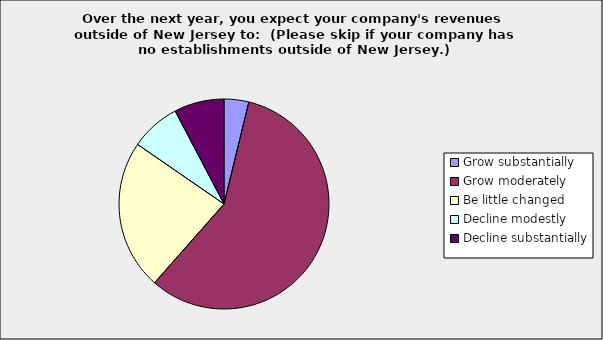
| Category | Series 0 |
|---|---|
| Grow substantially | 0.038 |
| Grow moderately | 0.577 |
| Be little changed | 0.231 |
| Decline modestly | 0.077 |
| Decline substantially | 0.077 |